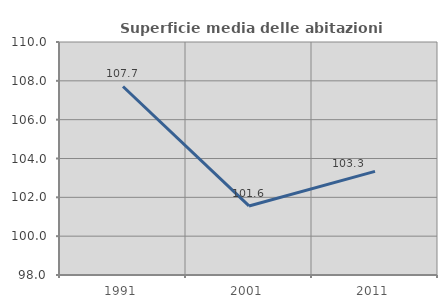
| Category | Superficie media delle abitazioni occupate |
|---|---|
| 1991.0 | 107.709 |
| 2001.0 | 101.556 |
| 2011.0 | 103.337 |